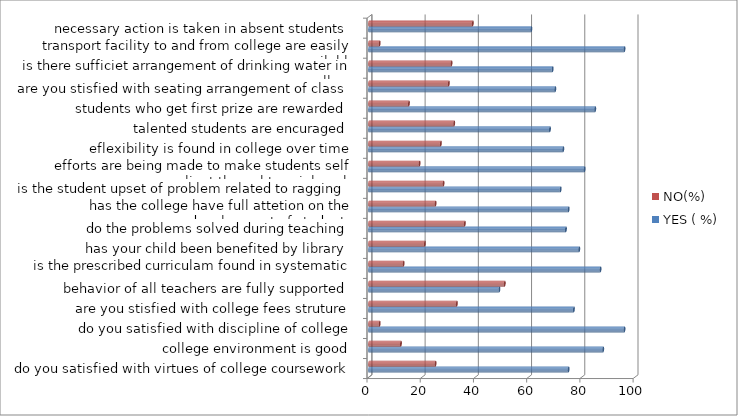
| Category | YES ( %) | NO(%) |
|---|---|---|
| do you satisfied with virtues of college coursework | 75 | 25 |
| college environment is good | 88 | 12 |
| do you satisfied with discipline of college | 96 | 4 |
| are you stisfied with college fees struture | 77 | 33 |
| behavior of all teachers are fully supported | 49 | 51 |
| is the prescribed curriculam found in systematic way | 87 | 13 |
| has your child been benefited by library | 79 | 21 |
| do the problems solved during teaching | 74 | 36 |
| has the college have full attetion on the development of students | 75 | 25 |
| is the student upset of problem related to ragging | 72 | 28 |
| efforts are being made to make students self reliant throught social work | 81 | 19 |
| eflexibility is found in college over time | 73 | 27 |
| talented students are encuraged | 68 | 32 |
| students who get first prize are rewarded | 85 | 15 |
| are you stisfied with seating arrangement of class | 70 | 30 |
| is there sufficiet arrangement of drinking water in college | 69 | 31 |
| transport facility to and from college are easily available | 96 | 4 |
| necessary action is taken in absent students | 61 | 39 |